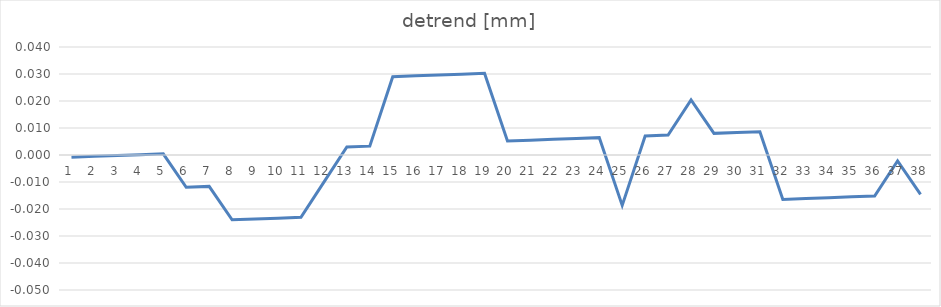
| Category | detrend [mm] |
|---|---|
| 0 | -0.001 |
| 1 | -0.001 |
| 2 | 0 |
| 3 | 0 |
| 4 | 0 |
| 5 | -0.012 |
| 6 | -0.012 |
| 7 | -0.024 |
| 8 | -0.024 |
| 9 | -0.023 |
| 10 | -0.023 |
| 11 | -0.01 |
| 12 | 0.003 |
| 13 | 0.003 |
| 14 | 0.029 |
| 15 | 0.029 |
| 16 | 0.03 |
| 17 | 0.03 |
| 18 | 0.03 |
| 19 | 0.005 |
| 20 | 0.005 |
| 21 | 0.006 |
| 22 | 0.006 |
| 23 | 0.006 |
| 24 | -0.019 |
| 25 | 0.007 |
| 26 | 0.007 |
| 27 | 0.02 |
| 28 | 0.008 |
| 29 | 0.008 |
| 30 | 0.009 |
| 31 | -0.016 |
| 32 | -0.016 |
| 33 | -0.016 |
| 34 | -0.015 |
| 35 | -0.015 |
| 36 | -0.002 |
| 37 | -0.015 |